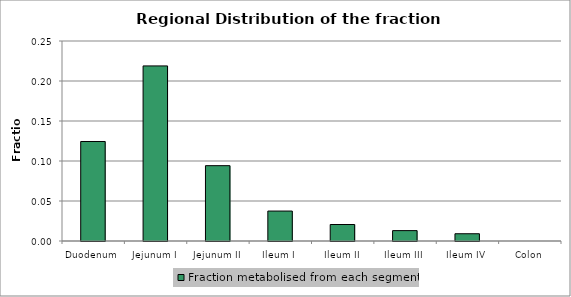
| Category | Fraction metabolised from each segment |
|---|---|
| Duodenum | 0.124 |
| Jejunum I | 0.219 |
| Jejunum II | 0.094 |
| Ileum I | 0.037 |
| Ileum II | 0.021 |
| Ileum III | 0.013 |
| Ileum IV | 0.009 |
| Colon | 0 |